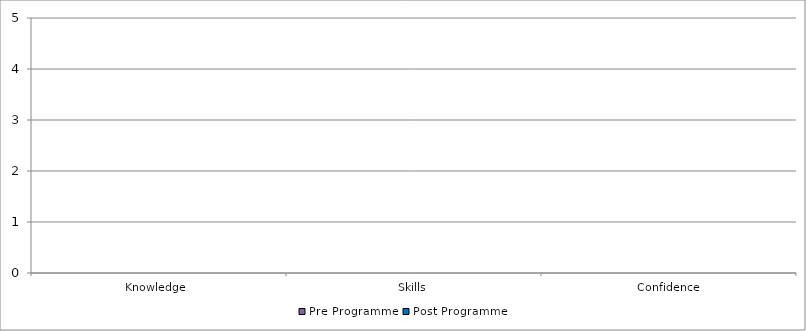
| Category | Pre Programme | Post Programme |
|---|---|---|
| Knowledge  | 0 | 0 |
| Skills | 0 | 0 |
| Confidence | 0 | 0 |